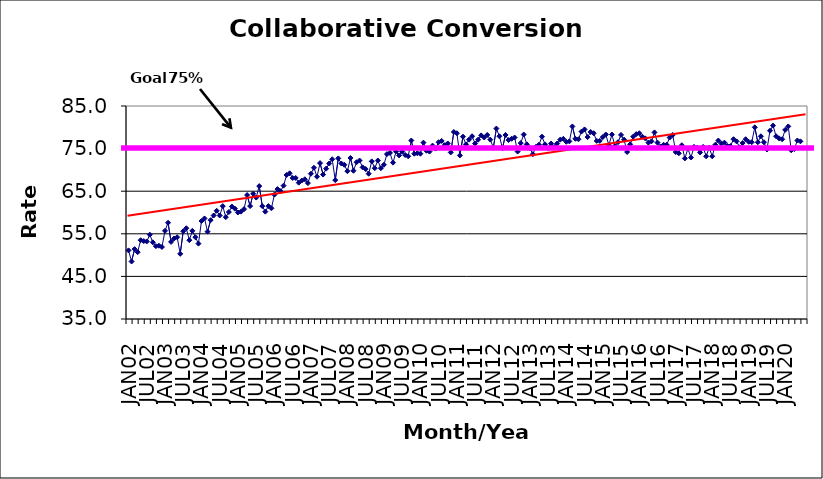
| Category | Series 0 |
|---|---|
| JAN02 | 51.1 |
| FEB02 | 48.5 |
| MAR02 | 51.4 |
| APR02 | 50.7 |
| MAY02 | 53.5 |
| JUN02 | 53.3 |
| JUL02 | 53.2 |
| AUG02 | 54.8 |
| SEP02 | 53 |
| OCT02 | 52.1 |
| NOV02 | 52.2 |
| DEC02 | 51.9 |
| JAN03 | 55.7 |
| FEB03 | 57.6 |
| MAR03 | 53.1 |
| APR03 | 53.9 |
| MAY03 | 54.2 |
| JUN03 | 50.3 |
| JUL03 | 55.6 |
| AUG03 | 56.3 |
| SEP03 | 53.5 |
| OCT03 | 55.7 |
| NOV03 | 54.2 |
| DEC03 | 52.7 |
| JAN04 | 58 |
| FEB04 | 58.6 |
| MAR04 | 55.5 |
| APR04 | 58.2 |
| MAY04 | 59.3 |
| JUN04 | 60.4 |
| JUL04 | 59.3 |
| AUG04 | 61.5 |
| SEP04 | 58.9 |
| OCT04 | 60.1 |
| NOV04 | 61.4 |
| DEC04 | 60.9 |
| JAN05 | 60 |
| FEB05 | 60.2 |
| MAR05 | 60.8 |
| APR05 | 64.1 |
| MAY05 | 61.5 |
| JUN05 | 64.4 |
| JUL05 | 63.5 |
| AUG05 | 66.2 |
| SEP05 | 61.5 |
| OCT05 | 60.2 |
| NOV05 | 61.5 |
| DEC05 | 61 |
| JAN06 | 64.2 |
| FEB06 | 65.5 |
| MAR06 | 65 |
| APR06 | 66.3 |
| MAY06 | 68.8 |
| JUN06 | 69.2 |
| JUL06 | 68.1 |
| AUG06 | 68.1 |
| SEP06 | 67 |
| OCT06 | 67.5 |
| NOV06 | 67.8 |
| DEC06 | 66.9 |
| JAN07 | 69.1 |
| FEB07 | 70.5 |
| MAR07 | 68.4 |
| APR07 | 71.6 |
| MAY07 | 68.9 |
| JUN07 | 70.3 |
| JUL07 | 71.5 |
| AUG07 | 72.5 |
| SEP07 | 67.6 |
| OCT07 | 72.7 |
| NOV07 | 71.5 |
| DEC07 | 71.2 |
| JAN08 | 69.7 |
| FEB08 | 72.8 |
| MAR08 | 69.8 |
| APR08 | 71.8 |
| MAY08 | 72.2 |
| JUN08 | 70.6 |
| JUL08 | 70.2 |
| AUG08 | 69.1 |
| SEP08 | 72 |
| OCT08 | 70.4 |
| NOV08 | 72.2 |
| DEC08 | 70.4 |
| JAN09 | 71.2 |
| FEB09 | 73.7 |
| MAR09 | 74 |
| APR09 | 71.7 |
| MAY09 | 74.3 |
| JUN09 | 73.4 |
| JUL09 | 74.3 |
| AUG09 | 73.5 |
| SEP09 | 73.2 |
| OCT09 | 76.9 |
| NOV09 | 73.8 |
| DEC09 | 73.9 |
| JAN10 | 73.8 |
| FEB10 | 76.4 |
| MAR10 | 74.5 |
| APR10 | 74.3 |
| MAY10 | 75.7 |
| JUN10 | 75 |
| JUL10 | 76.5 |
| AUG10 | 76.8 |
| SEP10 | 75.8 |
| OCT10 | 76.2 |
| NOV10 | 74.1 |
| DEC10 | 78.9 |
| JAN11 | 78.6 |
| FEB11 | 73.4 |
| MAR11 | 77.8 |
| APR11 | 76 |
| MAY11 | 77.1 |
| JUN11 | 77.9 |
| JUL11 | 76.2 |
| AUG11 | 77.1 |
| SEP11 | 78.1 |
| OCT11 | 77.6 |
| NOV11 | 78.2 |
| DEC11 | 77.1 |
| JAN12 | 75.2 |
| FEB12 | 79.7 |
| MAR12 | 77.9 |
| APR12 | 75.1 |
| MAY12 | 78.2 |
| JUN12 | 77 |
| JUL12 | 77.3 |
| AUG12 | 77.6 |
| SEP12 | 74.3 |
| OCT12 | 76.3 |
| NOV12 | 78.3 |
| DEC12 | 76 |
| JAN13 | 75.1 |
| FEB13 | 73.7 |
| MAR13 | 75.4 |
| APR13 | 75.9 |
| MAY13 | 77.8 |
| JUN13 | 76 |
| JUL13 | 75.1 |
| AUG13 | 76.2 |
| SEP13 | 75.4 |
| OCT13 | 76.2 |
| NOV13 | 77.1 |
| DEC13 | 77.3 |
| JAN14 | 76.6 |
| FEB14 | 76.7 |
| MAR14 | 80.2 |
| APR14 | 77.3 |
| MAY14 | 77.2 |
| JUN14 | 79 |
| JUL14 | 79.5 |
| AUG14 | 77.7 |
| SEP14 | 78.9 |
| OCT14 | 78.6 |
| NOV14 | 76.8 |
| DEC14 | 76.8 |
| JAN15 | 77.7 |
| FEB15 | 78.3 |
| MAR15 | 75.8 |
| APR15 | 78.3 |
| MAY15 | 75.6 |
| JUN15 | 76.5 |
| JUL15 | 78.2 |
| AUG15 | 77.1 |
| SEP15 | 74.2 |
| OCT15 | 76 |
| NOV15 | 77.8 |
| DEC15 | 78.4 |
| JAN16 | 78.6 |
| FEB16 | 77.8 |
| MAR16 | 77.4 |
| APR16 | 76.4 |
| MAY16 | 76.7 |
| JUN16 | 78.8 |
| JUL16 | 76.4 |
| AUG16 | 75.5 |
| SEP16 | 75.9 |
| OCT16 | 75.9 |
| NOV16 | 77.6 |
| DEC16 | 78.2 |
| JAN17 | 74.2 |
| FEB17 | 73.9 |
| MAR17 | 75.8 |
| APR17 | 72.7 |
| MAY17 | 75 |
| JUN17 | 72.9 |
| JUL17 | 75.4 |
| AUG17 | 75.2 |
| SEP17 | 74.1 |
| OCT17 | 75.4 |
| NOV17 | 73.2 |
| DEC17 | 75.2 |
| JAN18 | 73.2 |
| FEB18 | 75.9 |
| MAR18 | 76.9 |
| APR18 | 76.2 |
| MAY18 | 76.4 |
| JUN18 | 75.6 |
| JUL18 | 75.6 |
| AUG18 | 77.2 |
| SEP18 | 76.7 |
| OCT18 | 75.3 |
| NOV18 | 76.3 |
| DEC18 | 77.2 |
| JAN19 | 76.6 |
| FEB19 | 76.5 |
| MAR19 | 80 |
| APR19 | 76.5 |
| MAY19 | 77.9 |
| JUN19 | 76.5 |
| JUL19 | 74.8 |
| AUG19 | 79.2 |
| SEP19 | 80.4 |
| OCT19 | 77.9 |
| NOV19 | 77.4 |
| DEC19 | 77.2 |
| JAN20 | 79.4 |
| FEB20 | 80.2 |
| MAR20 | 74.6 |
| APR20 | 74.9 |
| MAY20 | 76.9 |
| JUN20 | 76.7 |